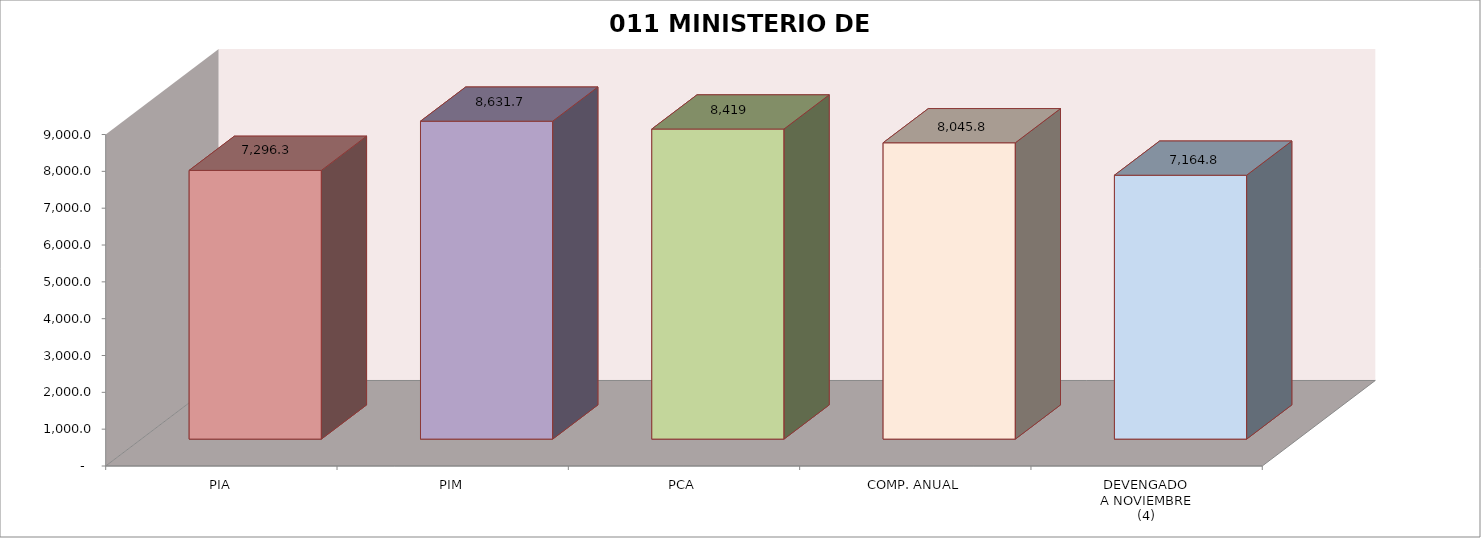
| Category | 011 MINISTERIO DE SALUD |
|---|---|
| PIA | 7296.309 |
| PIM | 8631.663 |
| PCA | 8419.034 |
| COMP. ANUAL | 8045.808 |
| DEVENGADO
A NOVIEMBRE
(4) | 7164.847 |